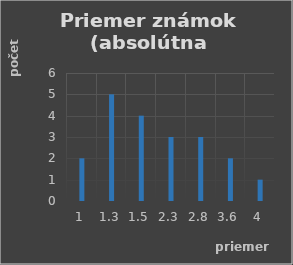
| Category | Series 0 |
|---|---|
| 1.0 | 2 |
| 1.3 | 5 |
| 1.5 | 4 |
| 2.3 | 3 |
| 2.8 | 3 |
| 3.6 | 2 |
| 4.0 | 1 |